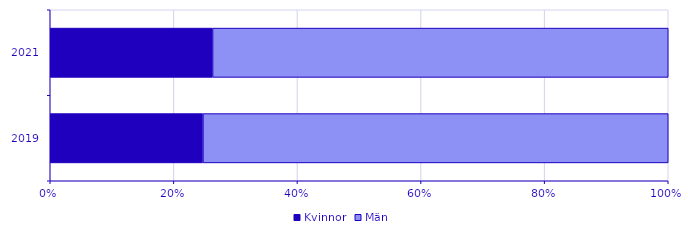
| Category | Kvinnor | Män |
|---|---|---|
| 2019.0 | 20863 | 63610 |
| 2021.0 | 23365 | 65588 |